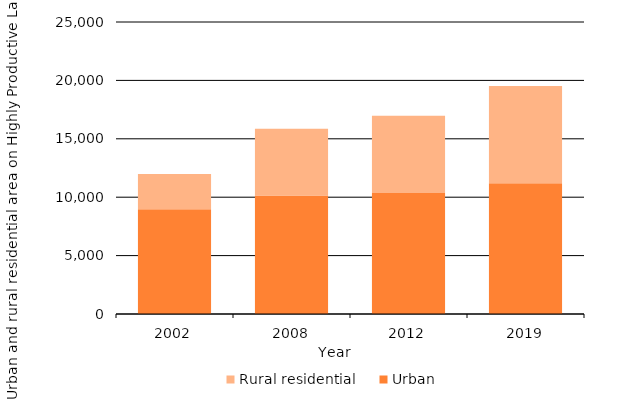
| Category | Urban | Rural residential |
|---|---|---|
| 2002.0 | 8973 | 3003 |
| 2008.0 | 10138 | 5724 |
| 2012.0 | 10364 | 6611 |
| 2019.0 | 11187 | 8323 |